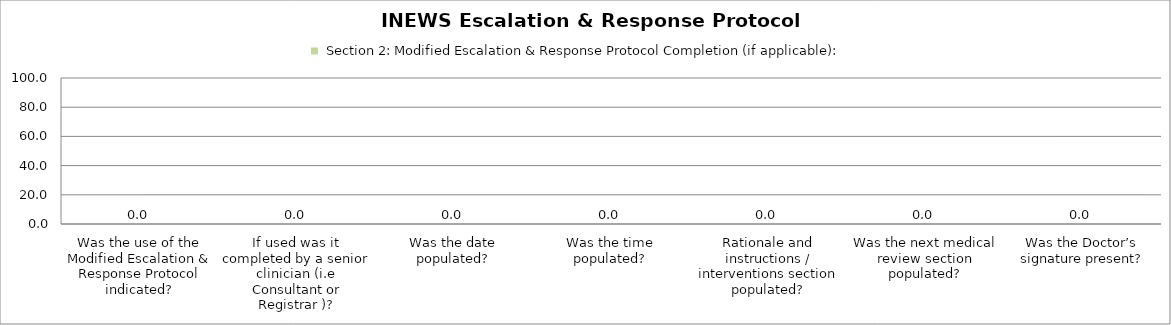
| Category |  Section 2: Modified Escalation & Response Protocol Completion (if applicable):  |
|---|---|
| Was the use of the Modified Escalation & Response Protocol indicated? | 0 |
| If used was it completed by a senior clinician (i.e Consultant or Registrar )? | 0 |
| Was the date populated? | 0 |
| Was the time populated? | 0 |
| Rationale and instructions / interventions section populated? | 0 |
| Was the next medical review section populated? | 0 |
| Was the Doctor’s signature present? | 0 |